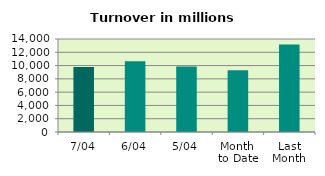
| Category | Series 0 |
|---|---|
| 7/04 | 9782.821 |
| 6/04 | 10658.843 |
| 5/04 | 9860.412 |
| Month 
to Date | 9306.612 |
| Last
Month | 13160.868 |